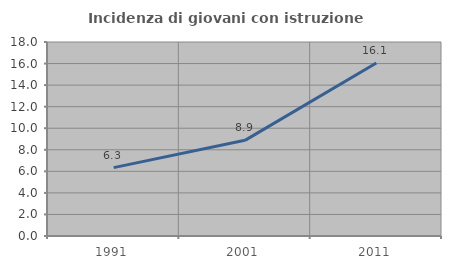
| Category | Incidenza di giovani con istruzione universitaria |
|---|---|
| 1991.0 | 6.341 |
| 2001.0 | 8.876 |
| 2011.0 | 16.058 |